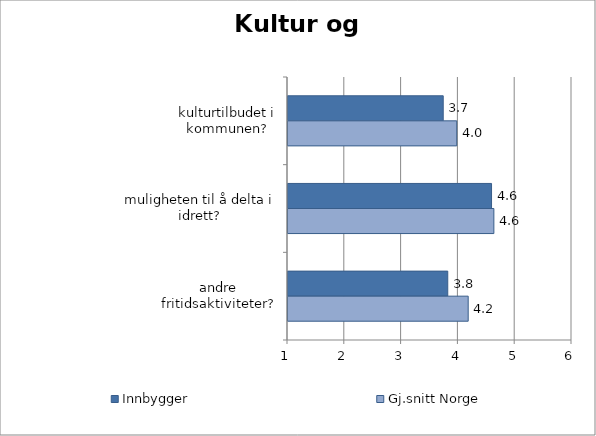
| Category | Innbygger | Gj.snitt Norge |
|---|---|---|
| kulturtilbudet i kommunen? | 3.733 | 3.971 |
| muligheten til å delta i idrett? | 4.583 | 4.624 |
| andre fritidsaktiviteter? | 3.813 | 4.172 |